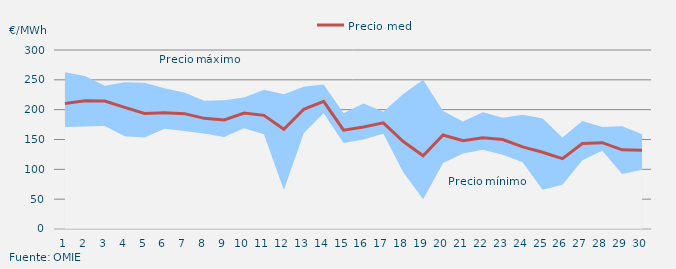
| Category | Precio medio |
|---|---|
| 1.0 | 210.453 |
| 2.0 | 214.738 |
| 3.0 | 214.504 |
| 4.0 | 203.861 |
| 5.0 | 193.654 |
| 6.0 | 194.942 |
| 7.0 | 193.32 |
| 8.0 | 185.448 |
| 9.0 | 182.67 |
| 10.0 | 194.351 |
| 11.0 | 190.498 |
| 12.0 | 167.06 |
| 13.0 | 200.617 |
| 14.0 | 214.045 |
| 15.0 | 165.59 |
| 16.0 | 170.813 |
| 17.0 | 177.903 |
| 18.0 | 146.536 |
| 19.0 | 122.612 |
| 20.0 | 157.48 |
| 21.0 | 148.028 |
| 22.0 | 152.75 |
| 23.0 | 149.855 |
| 24.0 | 137.588 |
| 25.0 | 128.703 |
| 26.0 | 117.943 |
| 27.0 | 143.27 |
| 28.0 | 144.664 |
| 29.0 | 132.74 |
| 30.0 | 132.133 |